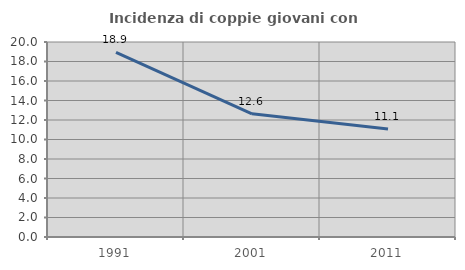
| Category | Incidenza di coppie giovani con figli |
|---|---|
| 1991.0 | 18.937 |
| 2001.0 | 12.635 |
| 2011.0 | 11.067 |